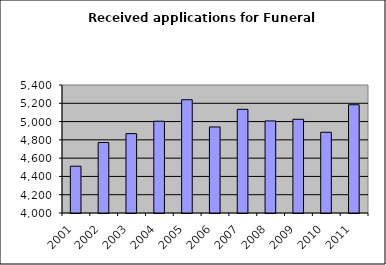
| Category | Series 1 |
|---|---|
| 2001.0 | 4512 |
| 2002.0 | 4771 |
| 2003.0 | 4868 |
| 2004.0 | 5004 |
| 2005.0 | 5239 |
| 2006.0 | 4941 |
| 2007.0 | 5134 |
| 2008.0 | 5007 |
| 2009.0 | 5025 |
| 2010.0 | 4883 |
| 2011.0 | 5184 |